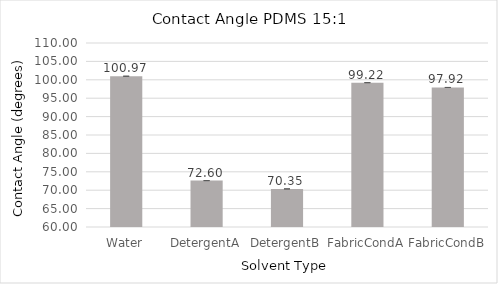
| Category | Series 0 |
|---|---|
| Water | 100.97 |
| DetergentA | 72.603 |
| DetergentB | 70.353 |
| FabricCondA | 99.223 |
| FabricCondB | 97.92 |